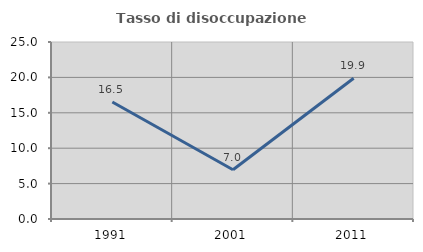
| Category | Tasso di disoccupazione giovanile  |
|---|---|
| 1991.0 | 16.529 |
| 2001.0 | 6.952 |
| 2011.0 | 19.872 |